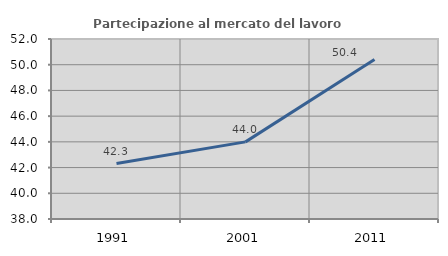
| Category | Partecipazione al mercato del lavoro  femminile |
|---|---|
| 1991.0 | 42.315 |
| 2001.0 | 43.999 |
| 2011.0 | 50.414 |